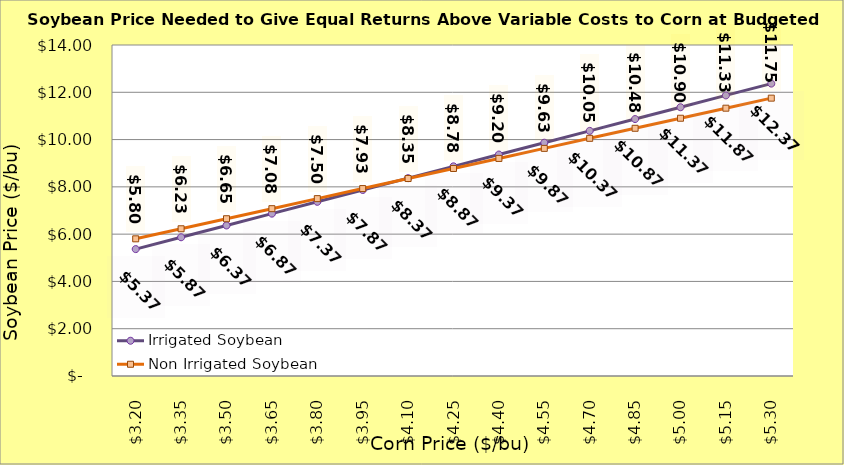
| Category | Irrigated Soybean | Non Irrigated Soybean |
|---|---|---|
| 3.2 | 5.367 | 5.802 |
| 3.35 | 5.867 | 6.227 |
| 3.5 | 6.367 | 6.652 |
| 3.65 | 6.867 | 7.077 |
| 3.8 | 7.367 | 7.502 |
| 3.9499999999999997 | 7.867 | 7.927 |
| 4.1 | 8.367 | 8.352 |
| 4.25 | 8.867 | 8.777 |
| 4.4 | 9.367 | 9.202 |
| 4.550000000000001 | 9.867 | 9.627 |
| 4.700000000000001 | 10.367 | 10.052 |
| 4.850000000000001 | 10.867 | 10.477 |
| 5.000000000000002 | 11.367 | 10.902 |
| 5.150000000000002 | 11.867 | 11.327 |
| 5.3000000000000025 | 12.367 | 11.752 |